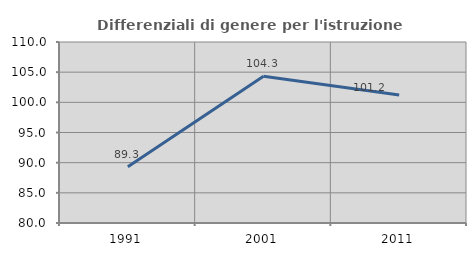
| Category | Differenziali di genere per l'istruzione superiore |
|---|---|
| 1991.0 | 89.323 |
| 2001.0 | 104.32 |
| 2011.0 | 101.224 |